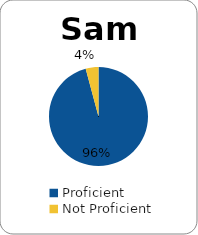
| Category | Series 0 |
|---|---|
| Proficient | 0.958 |
| Not Proficient | 0.042 |